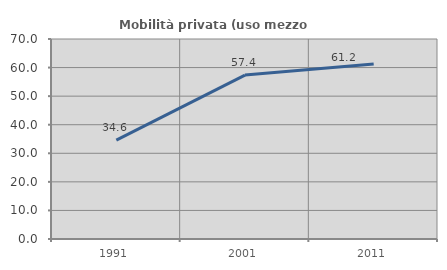
| Category | Mobilità privata (uso mezzo privato) |
|---|---|
| 1991.0 | 34.591 |
| 2001.0 | 57.384 |
| 2011.0 | 61.224 |